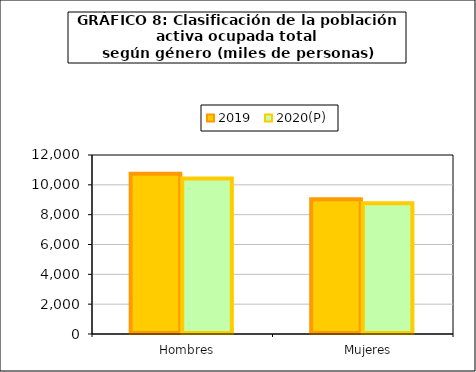
| Category | 2019 | 2020(P) |
|---|---|---|
|    Hombres | 10745.6 | 10429.65 |
|    Mujeres | 9033.7 | 8772.75 |